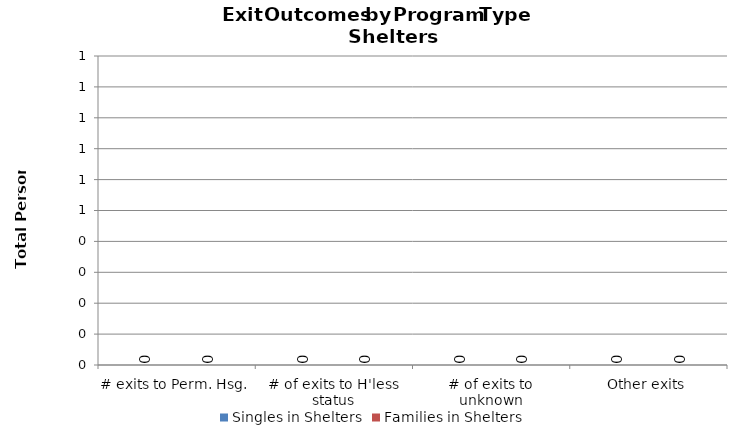
| Category | Singles in Shelters | Families in Shelters |
|---|---|---|
| # exits to Perm. Hsg.   | 0 | 0 |
| # of exits to H'less status | 0 | 0 |
| # of exits to unknown | 0 | 0 |
| Other exits | 0 | 0 |